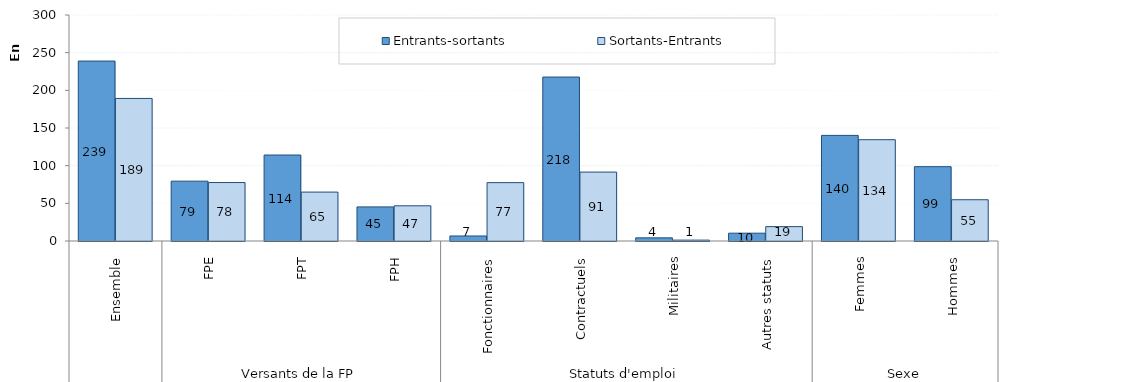
| Category | Entrants-sortants | Sortants-Entrants |
|---|---|---|
| 0 | 238839 | 189223 |
| 1 | 79454 | 77594 |
| 2 | 114119 | 64919 |
| 3 | 45266 | 46710 |
| 4 | 6660 | 77488 |
| 5 | 217636 | 91474 |
| 6 | 4169 | 1178 |
| 7 | 10374 | 19083 |
| 8 | 140177 | 134465 |
| 9 | 98662 | 54758 |